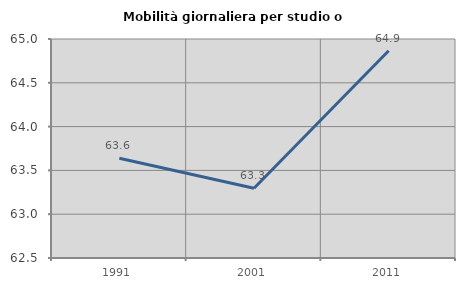
| Category | Mobilità giornaliera per studio o lavoro |
|---|---|
| 1991.0 | 63.639 |
| 2001.0 | 63.297 |
| 2011.0 | 64.866 |